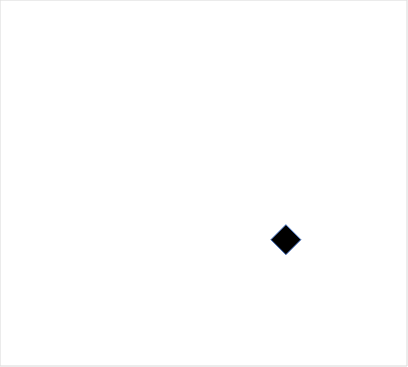
| Category | Series 0 |
|---|---|
| 48.0 | 25 |